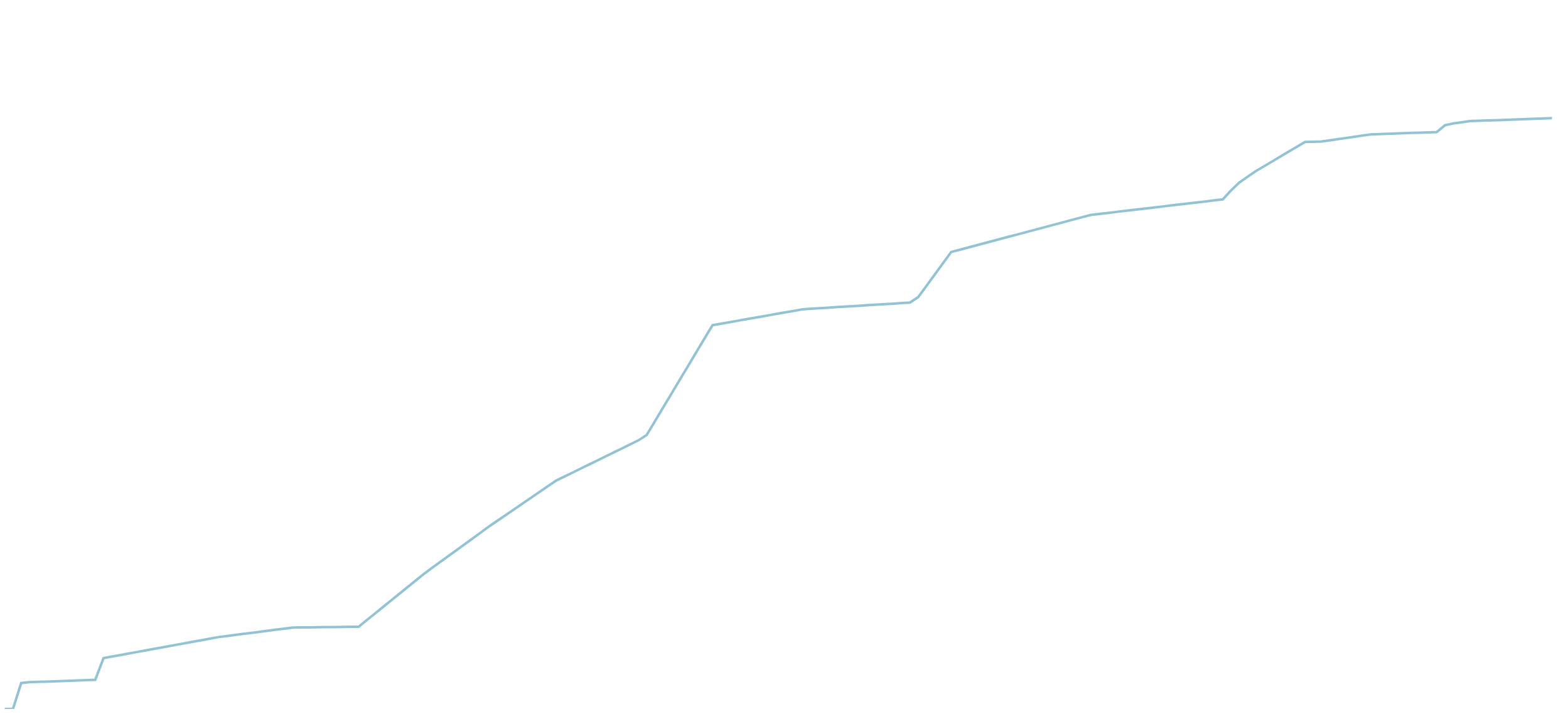
| Category | 0.030 0.060 0.071 0.082 0.091 0.094 0.097 0.100 0.103 0.106 0.279 0.452 0.625 0.798 0.971 1.144 1.317 1.490 1.663 1.913 2.163 2.413 2.663 2.913 3.163 3.412 3.661 3.745 3.825 3.908 3.998 4.075 4.152 4.229 4.306 4.383 4.460 5.475 6.490 7.505 8.520 9.535 10. |
|---|---|
| 0 | 0.003 |
| 1 | 0.005 |
| 2 | 4.387 |
| 3 | 4.531 |
| 4 | 4.581 |
| 5 | 4.631 |
| 6 | 4.681 |
| 7 | 4.731 |
| 8 | 4.781 |
| 9 | 4.831 |
| 10 | 4.881 |
| 11 | 4.931 |
| 12 | 8.603 |
| 13 | 8.858 |
| 14 | 9.113 |
| 15 | 9.368 |
| 16 | 9.623 |
| 17 | 9.878 |
| 18 | 10.133 |
| 19 | 10.388 |
| 20 | 10.643 |
| 21 | 10.898 |
| 22 | 11.153 |
| 23 | 11.408 |
| 24 | 11.663 |
| 25 | 11.918 |
| 26 | 12.171 |
| 27 | 12.35 |
| 28 | 12.529 |
| 29 | 12.708 |
| 30 | 12.887 |
| 31 | 13.066 |
| 32 | 13.245 |
| 33 | 13.424 |
| 34 | 13.603 |
| 35 | 13.778 |
| 36 | 13.796 |
| 37 | 13.814 |
| 38 | 13.832 |
| 39 | 13.85 |
| 40 | 13.868 |
| 41 | 13.886 |
| 42 | 13.904 |
| 43 | 13.918 |
| 44 | 15.046 |
| 45 | 16.173 |
| 46 | 17.3 |
| 47 | 18.427 |
| 48 | 19.554 |
| 49 | 20.681 |
| 50 | 21.808 |
| 51 | 22.935 |
| 52 | 23.948 |
| 53 | 24.961 |
| 54 | 25.974 |
| 55 | 26.987 |
| 56 | 28 |
| 57 | 29.013 |
| 58 | 30.026 |
| 59 | 31.038 |
| 60 | 31.991 |
| 61 | 32.944 |
| 62 | 33.897 |
| 63 | 34.85 |
| 64 | 35.803 |
| 65 | 36.756 |
| 66 | 37.709 |
| 67 | 38.652 |
| 68 | 39.336 |
| 69 | 40.017 |
| 70 | 40.698 |
| 71 | 41.379 |
| 72 | 42.06 |
| 73 | 42.741 |
| 74 | 43.422 |
| 75 | 44.103 |
| 76 | 44.784 |
| 77 | 45.465 |
| 78 | 46.372 |
| 79 | 48.696 |
| 80 | 51.02 |
| 81 | 53.344 |
| 82 | 55.668 |
| 83 | 57.992 |
| 84 | 60.316 |
| 85 | 62.64 |
| 86 | 64.962 |
| 87 | 65.207 |
| 88 | 65.452 |
| 89 | 65.697 |
| 90 | 65.942 |
| 91 | 66.187 |
| 92 | 66.432 |
| 93 | 66.677 |
| 94 | 66.922 |
| 95 | 67.167 |
| 96 | 67.412 |
| 97 | 67.657 |
| 98 | 67.744 |
| 99 | 67.831 |
| 100 | 67.918 |
| 101 | 68.005 |
| 102 | 68.092 |
| 103 | 68.179 |
| 104 | 68.266 |
| 105 | 68.353 |
| 106 | 68.44 |
| 107 | 68.527 |
| 108 | 68.614 |
| 109 | 68.701 |
| 110 | 68.787 |
| 111 | 69.713 |
| 112 | 71.622 |
| 113 | 73.529 |
| 114 | 75.436 |
| 115 | 77.343 |
| 116 | 77.713 |
| 117 | 78.083 |
| 118 | 78.453 |
| 119 | 78.823 |
| 120 | 79.193 |
| 121 | 79.563 |
| 122 | 79.933 |
| 123 | 80.303 |
| 124 | 80.673 |
| 125 | 81.043 |
| 126 | 81.413 |
| 127 | 81.783 |
| 128 | 82.153 |
| 129 | 82.523 |
| 130 | 82.893 |
| 131 | 83.263 |
| 132 | 83.624 |
| 133 | 83.791 |
| 134 | 83.955 |
| 135 | 84.119 |
| 136 | 84.283 |
| 137 | 84.447 |
| 138 | 84.611 |
| 139 | 84.775 |
| 140 | 84.939 |
| 141 | 85.103 |
| 142 | 85.267 |
| 143 | 85.431 |
| 144 | 85.595 |
| 145 | 85.759 |
| 146 | 85.923 |
| 147 | 86.087 |
| 148 | 86.251 |
| 149 | 87.764 |
| 150 | 89.096 |
| 151 | 90.059 |
| 152 | 91.021 |
| 153 | 91.846 |
| 154 | 92.671 |
| 155 | 93.496 |
| 156 | 94.321 |
| 157 | 95.146 |
| 158 | 95.971 |
| 159 | 96.009 |
| 160 | 96.045 |
| 161 | 96.247 |
| 162 | 96.448 |
| 163 | 96.649 |
| 164 | 96.85 |
| 165 | 97.051 |
| 166 | 97.252 |
| 167 | 97.302 |
| 168 | 97.352 |
| 169 | 97.402 |
| 170 | 97.452 |
| 171 | 97.502 |
| 172 | 97.552 |
| 173 | 97.602 |
| 174 | 97.65 |
| 175 | 98.799 |
| 176 | 99.105 |
| 177 | 99.302 |
| 178 | 99.498 |
| 179 | 99.55 |
| 180 | 99.6 |
| 181 | 99.65 |
| 182 | 99.7 |
| 183 | 99.75 |
| 184 | 99.8 |
| 185 | 99.85 |
| 186 | 99.9 |
| 187 | 99.95 |
| 188 | 100 |